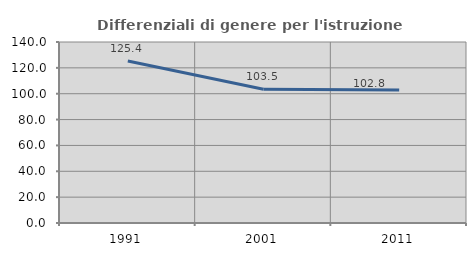
| Category | Differenziali di genere per l'istruzione superiore |
|---|---|
| 1991.0 | 125.351 |
| 2001.0 | 103.496 |
| 2011.0 | 102.826 |